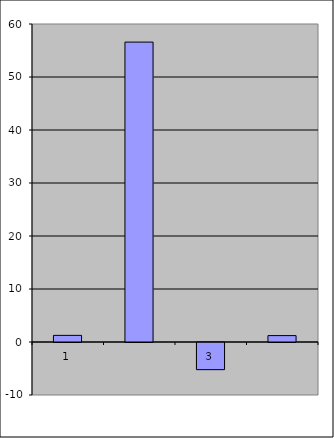
| Category | Series 0 |
|---|---|
| 0 | 1.25 |
| 1 | 56.587 |
| 2 | -5.118 |
| 3 | 1.209 |